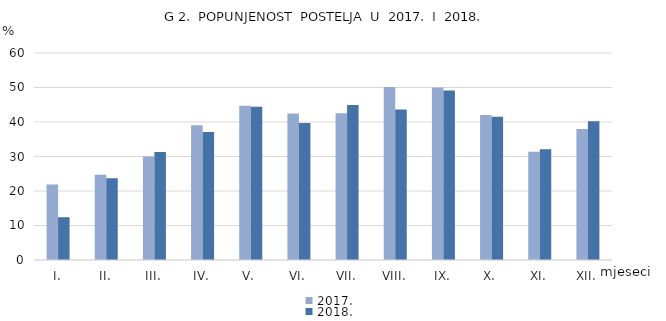
| Category | 2017. | 2018. |
|---|---|---|
| I. | 21.896 | 12.4 |
| II. | 24.674 | 23.7 |
| III. | 29.986 | 31.3 |
| IV. | 39.064 | 37.1 |
| V. | 44.705 | 44.4 |
| VI. | 42.493 | 39.7 |
| VII. | 42.517 | 44.9 |
| VIII. | 50.125 | 43.6 |
| IX. | 49.982 | 49.1 |
| X. | 42.048 | 41.5 |
| XI. | 31.381 | 32.1 |
| XII. | 37.987 | 40.2 |